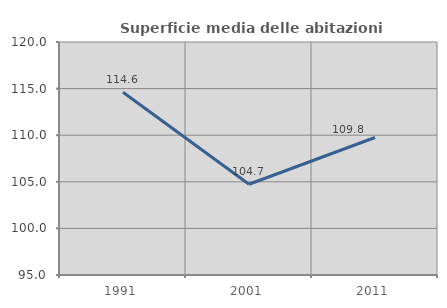
| Category | Superficie media delle abitazioni occupate |
|---|---|
| 1991.0 | 114.616 |
| 2001.0 | 104.737 |
| 2011.0 | 109.752 |